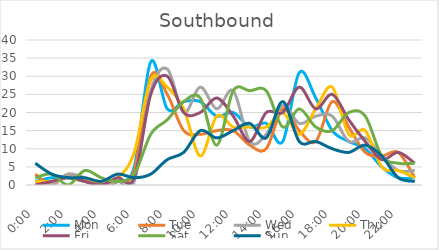
| Category | Mon | Tue | Wed | Thu | Fri | Sat | Sun |
|---|---|---|---|---|---|---|---|
| 0.0 | 1 | 3 | 1 | 1 | 0 | 2 | 6 |
| 0.041667 | 2 | 0 | 0 | 1 | 1 | 3 | 3 |
| 0.083333 | 2 | 3 | 3 | 2 | 2 | 0 | 2 |
| 0.125 | 1 | 1 | 2 | 1 | 1 | 4 | 2 |
| 0.166667 | 0 | 0 | 0 | 1 | 0 | 2 | 1 |
| 0.208333 | 1 | 1 | 1 | 2 | 2 | 1 | 3 |
| 0.25 | 5 | 4 | 1 | 9 | 2 | 3 | 2 |
| 0.291667 | 34 | 30 | 26 | 29 | 25 | 14 | 3 |
| 0.333333 | 21 | 25 | 32 | 27 | 30 | 18 | 7 |
| 0.375 | 23 | 15 | 20 | 21 | 20 | 23 | 9 |
| 0.416667 | 23 | 14 | 27 | 8 | 20 | 24 | 15 |
| 0.458333 | 19 | 15 | 21 | 19 | 24 | 11 | 13 |
| 0.5 | 20 | 15 | 26 | 16 | 19 | 26 | 15 |
| 0.541667 | 16 | 11 | 12 | 16 | 12 | 26 | 17 |
| 0.5833333333333334 | 17 | 10 | 14 | 16 | 20 | 26 | 13 |
| 0.625 | 12 | 21 | 22 | 20 | 20 | 16 | 23 |
| 0.666667 | 31 | 15 | 17 | 14 | 27 | 21 | 12 |
| 0.708333 | 24 | 12 | 19 | 21 | 21 | 16 | 12 |
| 0.75 | 15 | 23 | 19 | 27 | 25 | 15 | 10 |
| 0.791667 | 12 | 16 | 12 | 14 | 18 | 20 | 9 |
| 0.833333 | 10 | 9 | 13 | 15 | 12 | 19 | 11 |
| 0.875 | 5 | 8 | 8 | 5 | 7 | 8 | 8 |
| 0.916667 | 2 | 9 | 4 | 4 | 9 | 6 | 2 |
| 0.958333 | 2 | 2 | 4 | 2 | 6 | 6 | 1 |